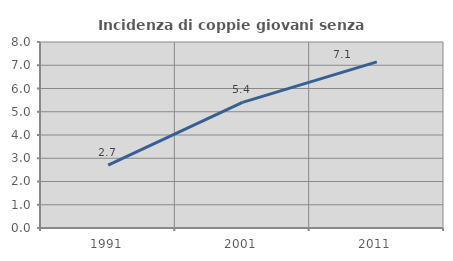
| Category | Incidenza di coppie giovani senza figli |
|---|---|
| 1991.0 | 2.703 |
| 2001.0 | 5.405 |
| 2011.0 | 7.143 |